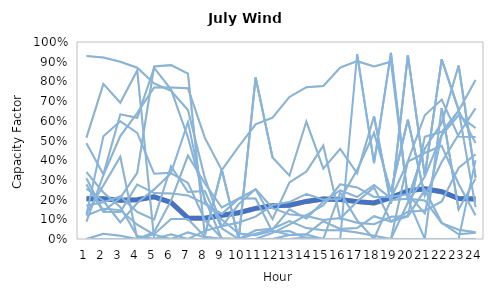
| Category | Series 0 | Series 52 | Series 53 | Series 54 | Series 55 | Series 56 | Series 57 | Series 58 | Series 59 | Series 60 | Series 61 | Series 62 | Series 63 | Series 64 | Series 65 | Series 66 | Series 67 | Series 68 | Series 69 | Series 70 | Series 71 | Series 72 | Series 73 | Series 74 | Series 75 | Series 76 | Series 77 | Series 78 | Series 79 | Series 80 | Series 81 | Series 82 | Series 83 | Series 84 | Series 85 | Series 86 | Series 87 | Series 88 | Series 89 | Series 90 | Series 91 | Series 92 | Series 93 | Series 94 | Series 95 | Series 96 | Series 97 | Series 98 | Series 99 | Series 100 | Series 101 | Series 1 | Series 2 | Series 3 | Series 4 | Series 5 | Series 6 | Series 7 | Series 8 | Series 9 | Series 10 | Series 11 | Series 12 | Series 13 | Series 14 | Series 15 | Series 16 | Series 17 | Series 18 | Series 19 | Series 20 | Series 21 | Series 22 | Series 23 | Series 24 | Series 25 | Series 26 | Series 27 | Series 28 | Series 29 | Series 30 | Series 31 | Series 32 | Series 33 | Series 34 | Series 35 | Series 36 | Series 37 | Series 38 | Series 39 | Series 40 | Series 41 | Series 42 | Series 43 | Series 44 | Series 45 | Series 46 | Series 47 | Series 48 | Series 49 | Series 50 | Series 51 |
|---|---|---|---|---|---|---|---|---|---|---|---|---|---|---|---|---|---|---|---|---|---|---|---|---|---|---|---|---|---|---|---|---|---|---|---|---|---|---|---|---|---|---|---|---|---|---|---|---|---|---|---|---|---|---|---|---|---|---|---|---|---|---|---|---|---|---|---|---|---|---|---|---|---|---|---|---|---|---|---|---|---|---|---|---|---|---|---|---|---|---|---|---|---|---|---|---|---|---|---|---|---|---|
| 0 | 0.204 | 0.308 |  |  |  | 0.929 |  |  |  | 0 |  |  |  | 0.123 |  |  |  | 0.339 |  | 0.119 |  | 0.255 |  | 0 |  | 0.129 |  |  |  | 0.514 |  |  |  | 0.276 |  |  |  | 0.088 |  |  |  | 0.486 |  |  |  | 0 |  |  |  |  | 0.171 | 0.204 | 0.308 |  |  |  | 0.929 |  |  |  | 0 |  |  |  | 0.123 |  |  |  | 0.339 |  | 0.119 |  | 0.255 |  | 0 |  | 0.129 |  |  |  | 0.514 |  |  |  | 0.276 |  |  |  | 0.088 |  |  |  | 0.486 |  |  |  | 0 |  |  |  |  | 0.171 |
| 1 | 0.204 | 0.14 |  |  |  | 0.921 |  |  |  | 0 |  |  |  | 0.521 |  |  |  | 0.236 |  | 0.154 |  | 0.194 |  | 0.026 |  | 0.272 |  |  |  | 0.787 |  |  |  | 0.138 |  |  |  | 0.325 |  |  |  | 0.328 |  |  |  | 0 |  |  |  |  | 0.186 | 0.204 | 0.14 |  |  |  | 0.921 |  |  |  | 0 |  |  |  | 0.521 |  |  |  | 0.236 |  | 0.154 |  | 0.194 |  | 0.026 |  | 0.272 |  |  |  | 0.787 |  |  |  | 0.138 |  |  |  | 0.325 |  |  |  | 0.328 |  |  |  | 0 |  |  |  |  | 0.186 |
| 2 | 0.197 | 0.209 |  |  |  | 0.899 |  |  |  | 0 |  |  |  | 0.597 |  |  |  | 0.162 |  | 0.147 |  | 0.084 |  | 0.017 |  | 0.417 |  |  |  | 0.692 |  |  |  | 0.138 |  |  |  | 0.522 |  |  |  | 0.633 |  |  |  | 0 |  |  |  |  | 0.216 | 0.197 | 0.209 |  |  |  | 0.899 |  |  |  | 0 |  |  |  | 0.597 |  |  |  | 0.162 |  | 0.147 |  | 0.084 |  | 0.017 |  | 0.417 |  |  |  | 0.692 |  |  |  | 0.138 |  |  |  | 0.522 |  |  |  | 0.633 |  |  |  | 0 |  |  |  |  | 0.216 |
| 3 | 0.199 | 0.336 |  |  |  | 0.869 |  |  |  | 0 |  |  |  | 0.538 |  |  |  | 0.015 |  | 0.072 |  | 0.182 |  | 0 |  | 0 |  |  |  | 0.855 |  |  |  | 0.277 |  |  |  | 0.64 |  |  |  | 0.615 |  |  |  | 0 |  |  |  |  | 0.137 | 0.199 | 0.336 |  |  |  | 0.869 |  |  |  | 0 |  |  |  | 0.538 |  |  |  | 0.015 |  | 0.072 |  | 0.182 |  | 0 |  | 0 |  |  |  | 0.855 |  |  |  | 0.277 |  |  |  | 0.64 |  |  |  | 0.615 |  |  |  | 0 |  |  |  |  | 0.137 |
| 4 | 0.214 | 0.876 |  |  |  | 0.789 |  |  |  | 0.024 |  |  |  | 0.331 |  |  |  | 0 |  | 0.022 |  | 0.252 |  | 0 |  | 0.034 |  |  |  | 0 |  |  |  | 0.233 |  |  |  | 0.769 |  |  |  | 0.869 |  |  |  | 0 |  |  |  |  | 0.098 | 0.214 | 0.876 |  |  |  | 0.789 |  |  |  | 0.024 |  |  |  | 0.331 |  |  |  | 0 |  | 0.022 |  | 0.252 |  | 0 |  | 0.034 |  |  |  | 0 |  |  |  | 0.233 |  |  |  | 0.769 |  |  |  | 0.869 |  |  |  | 0 |  |  |  |  | 0.098 |
| 5 | 0.186 | 0.883 |  |  |  | 0.753 |  |  |  | 0.101 |  |  |  | 0.336 |  |  |  | 0.024 |  | 0 |  | 0.334 |  | 0 |  | 0.194 |  |  |  | 0 |  |  |  | 0.232 |  |  |  | 0.769 |  |  |  | 0.759 |  |  |  | 0 |  |  |  |  | 0.37 | 0.186 | 0.883 |  |  |  | 0.753 |  |  |  | 0.101 |  |  |  | 0.336 |  |  |  | 0.024 |  | 0 |  | 0.334 |  | 0 |  | 0.194 |  |  |  | 0 |  |  |  | 0.232 |  |  |  | 0.769 |  |  |  | 0.759 |  |  |  | 0 |  |  |  |  | 0.37 |
| 6 | 0.106 | 0.84 |  |  |  | 0.654 |  |  |  | 0.101 |  |  |  | 0.593 |  |  |  | 0 |  | 0 |  | 0.285 |  | 0.033 |  | 0.424 |  |  |  | 0 |  |  |  | 0.221 |  |  |  | 0.765 |  |  |  | 0.515 |  |  |  | 0 |  |  |  |  | 0.239 | 0.106 | 0.84 |  |  |  | 0.654 |  |  |  | 0.101 |  |  |  | 0.593 |  |  |  | 0 |  | 0 |  | 0.285 |  | 0.033 |  | 0.424 |  |  |  | 0 |  |  |  | 0.221 |  |  |  | 0.765 |  |  |  | 0.515 |  |  |  | 0 |  |  |  |  | 0.239 |
| 7 | 0.105 | 0.019 |  |  |  | 0.31 |  |  |  | 0.012 |  |  |  | 0.188 |  |  |  | 0 |  | 0 |  | 0.096 |  | 0.008 |  | 0.282 |  |  |  | 0.041 |  |  |  | 0.178 |  |  |  | 0.513 |  |  |  | 0.202 |  |  |  | 0 |  |  |  |  | 0.244 | 0.105 | 0.019 |  |  |  | 0.31 |  |  |  | 0.012 |  |  |  | 0.188 |  |  |  | 0 |  | 0 |  | 0.096 |  | 0.008 |  | 0.282 |  |  |  | 0.041 |  |  |  | 0.178 |  |  |  | 0.513 |  |  |  | 0.202 |  |  |  | 0 |  |  |  |  | 0.244 |
| 8 | 0.121 | 0.351 |  |  |  | 0.063 |  |  |  | 0 |  |  |  | 0.099 |  |  |  | 0 |  | 0 |  | 0.004 |  | 0 |  | 0.16 |  |  |  | 0.065 |  |  |  | 0.127 |  |  |  | 0.35 |  |  |  | 0 |  |  |  | 0 |  |  |  |  | 0.054 | 0.121 | 0.351 |  |  |  | 0.063 |  |  |  | 0 |  |  |  | 0.099 |  |  |  | 0 |  | 0 |  | 0.004 |  | 0 |  | 0.16 |  |  |  | 0.065 |  |  |  | 0.127 |  |  |  | 0.35 |  |  |  | 0 |  |  |  | 0 |  |  |  |  | 0.054 |
| 9 | 0.133 | 0 |  |  |  | 0.177 |  |  |  | 0 |  |  |  | 0.028 |  |  |  | 0 |  | 0 |  | 0 |  | 0 |  | 0.206 |  |  |  | 0.084 |  |  |  | 0.205 |  |  |  | 0.47 |  |  |  | 0 |  |  |  | 0 |  |  |  |  | 0 | 0.133 | 0 |  |  |  | 0.177 |  |  |  | 0 |  |  |  | 0.028 |  |  |  | 0 |  | 0 |  | 0 |  | 0 |  | 0.206 |  |  |  | 0.084 |  |  |  | 0.205 |  |  |  | 0.47 |  |  |  | 0 |  |  |  | 0 |  |  |  |  | 0 |
| 10 | 0.155 | 0.82 |  |  |  | 0.253 |  |  |  | 0 |  |  |  | 0.019 |  |  |  | 0 |  | 0 |  | 0.044 |  | 0 |  | 0.205 |  |  |  | 0.113 |  |  |  | 0.252 |  |  |  | 0.582 |  |  |  | 0.027 |  |  |  | 0 |  |  |  |  | 0 | 0.155 | 0.82 |  |  |  | 0.253 |  |  |  | 0 |  |  |  | 0.019 |  |  |  | 0 |  | 0 |  | 0.044 |  | 0 |  | 0.205 |  |  |  | 0.113 |  |  |  | 0.252 |  |  |  | 0.582 |  |  |  | 0.027 |  |  |  | 0 |  |  |  |  | 0 |
| 11 | 0.169 | 0.414 |  |  |  | 0.156 |  |  |  | 0 |  |  |  | 0.042 |  |  |  | 0.031 |  | 0 |  | 0.052 |  | 0 |  | 0.036 |  |  |  | 0.172 |  |  |  | 0.101 |  |  |  | 0.616 |  |  |  | 0.049 |  |  |  | 0 |  |  |  |  | 0 | 0.169 | 0.414 |  |  |  | 0.156 |  |  |  | 0 |  |  |  | 0.042 |  |  |  | 0.031 |  | 0 |  | 0.052 |  | 0 |  | 0.036 |  |  |  | 0.172 |  |  |  | 0.101 |  |  |  | 0.616 |  |  |  | 0.049 |  |  |  | 0 |  |  |  |  | 0 |
| 12 | 0.172 | 0.321 |  |  |  | 0.125 |  |  |  | 0 |  |  |  | 0.02 |  |  |  | 0.073 |  | 0 |  | 0.09 |  | 0 |  | 0.04 |  |  |  | 0.187 |  |  |  | 0.288 |  |  |  | 0.721 |  |  |  | 0.151 |  |  |  | 0.021 |  |  |  |  | 0 | 0.172 | 0.321 |  |  |  | 0.125 |  |  |  | 0 |  |  |  | 0.02 |  |  |  | 0.073 |  | 0 |  | 0.09 |  | 0 |  | 0.04 |  |  |  | 0.187 |  |  |  | 0.288 |  |  |  | 0.721 |  |  |  | 0.151 |  |  |  | 0.021 |  |  |  |  | 0 |
| 13 | 0.191 | 0.596 |  |  |  | 0.117 |  |  |  | 0.007 |  |  |  | 0.023 |  |  |  | 0.122 |  | 0 |  | 0.055 |  | 0 |  | 0.002 |  |  |  | 0.229 |  |  |  | 0.342 |  |  |  | 0.771 |  |  |  | 0.104 |  |  |  | 0.024 |  |  |  |  | 0 | 0.191 | 0.596 |  |  |  | 0.117 |  |  |  | 0.007 |  |  |  | 0.023 |  |  |  | 0.122 |  | 0 |  | 0.055 |  | 0 |  | 0.002 |  |  |  | 0.229 |  |  |  | 0.342 |  |  |  | 0.771 |  |  |  | 0.104 |  |  |  | 0.024 |  |  |  |  | 0 |
| 14 | 0.203 | 0.357 |  |  |  | 0.096 |  |  |  | 0 |  |  |  | 0 |  |  |  | 0.171 |  | 0 |  | 0.045 |  | 0 |  | 0 |  |  |  | 0.2 |  |  |  | 0.474 |  |  |  | 0.777 |  |  |  | 0.19 |  |  |  | 0.09 |  |  |  |  | 0 | 0.203 | 0.357 |  |  |  | 0.096 |  |  |  | 0 |  |  |  | 0 |  |  |  | 0.171 |  | 0 |  | 0.045 |  | 0 |  | 0 |  |  |  | 0.2 |  |  |  | 0.474 |  |  |  | 0.777 |  |  |  | 0.19 |  |  |  | 0.09 |  |  |  |  | 0 |
| 15 | 0.2 | 0.458 |  |  |  | 0.106 |  |  |  | 0 |  |  |  | 0 |  |  |  | 0.278 |  | 0 |  | 0.044 |  | 0 |  | 0.236 |  |  |  | 0.203 |  |  |  | 0.104 |  |  |  | 0.87 |  |  |  | 0.247 |  |  |  | 0.051 |  |  |  |  | 0 | 0.2 | 0.458 |  |  |  | 0.106 |  |  |  | 0 |  |  |  | 0 |  |  |  | 0.278 |  | 0 |  | 0.044 |  | 0 |  | 0.236 |  |  |  | 0.203 |  |  |  | 0.104 |  |  |  | 0.87 |  |  |  | 0.247 |  |  |  | 0.051 |  |  |  |  | 0 |
| 16 | 0.19 | 0.334 |  |  |  | 0.082 |  |  |  | 0 |  |  |  | 0.939 |  |  |  | 0.262 |  | 0 |  | 0.033 |  | 0 |  | 0.095 |  |  |  | 0.35 |  |  |  | 0.19 |  |  |  | 0.903 |  |  |  | 0.213 |  |  |  | 0.055 |  |  |  |  | 0 | 0.19 | 0.334 |  |  |  | 0.082 |  |  |  | 0 |  |  |  | 0.939 |  |  |  | 0.262 |  | 0 |  | 0.033 |  | 0 |  | 0.095 |  |  |  | 0.35 |  |  |  | 0.19 |  |  |  | 0.903 |  |  |  | 0.213 |  |  |  | 0.055 |  |  |  |  | 0 |
| 17 | 0.183 | 0.623 |  |  |  | 0.075 |  |  |  | 0 |  |  |  | 0.385 |  |  |  | 0.214 |  | 0 |  | 0.017 |  | 0 |  | 0 |  |  |  | 0.538 |  |  |  | 0.262 |  |  |  | 0.876 |  |  |  | 0.275 |  |  |  | 0.116 |  |  |  |  | 0 | 0.183 | 0.623 |  |  |  | 0.075 |  |  |  | 0 |  |  |  | 0.385 |  |  |  | 0.214 |  | 0 |  | 0.017 |  | 0 |  | 0 |  |  |  | 0.538 |  |  |  | 0.262 |  |  |  | 0.876 |  |  |  | 0.275 |  |  |  | 0.116 |  |  |  |  | 0 |
| 18 | 0.21 | 0.178 |  |  |  | 0.113 |  |  |  | 0 |  |  |  | 0.945 |  |  |  | 0.214 |  | 0 |  | 0 |  | 0 |  | 0.198 |  |  |  | 0.241 |  |  |  | 0.089 |  |  |  | 0.9 |  |  |  | 0.206 |  |  |  | 0.088 |  |  |  |  | 0 | 0.21 | 0.178 |  |  |  | 0.113 |  |  |  | 0 |  |  |  | 0.945 |  |  |  | 0.214 |  | 0 |  | 0 |  | 0 |  | 0.198 |  |  |  | 0.241 |  |  |  | 0.089 |  |  |  | 0.9 |  |  |  | 0.206 |  |  |  | 0.088 |  |  |  |  | 0 |
| 19 | 0.245 | 0.933 |  |  |  | 0.115 |  |  |  | 0.395 |  |  |  | 0.2 |  |  |  | 0.228 |  | 0 |  | 0.185 |  | 0 |  | 0.204 |  |  |  | 0.605 |  |  |  | 0.138 |  |  |  | 0.203 |  |  |  | 0.393 |  |  |  | 0.115 |  |  |  |  | 0 | 0.245 | 0.933 |  |  |  | 0.115 |  |  |  | 0.395 |  |  |  | 0.2 |  |  |  | 0.228 |  | 0 |  | 0.185 |  | 0 |  | 0.204 |  |  |  | 0.605 |  |  |  | 0.138 |  |  |  | 0.203 |  |  |  | 0.393 |  |  |  | 0.115 |  |  |  |  | 0 |
| 20 | 0.254 | 0.322 |  |  |  | 0.519 |  |  |  | 0.628 |  |  |  | 0 |  |  |  | 0.13 |  | 0 |  | 0.317 |  | 0 |  | 0.196 |  |  |  | 0.22 |  |  |  | 0.145 |  |  |  | 0.459 |  |  |  | 0.437 |  |  |  | 0.249 |  |  |  |  | 0 | 0.254 | 0.322 |  |  |  | 0.519 |  |  |  | 0.628 |  |  |  | 0 |  |  |  | 0.13 |  | 0 |  | 0.317 |  | 0 |  | 0.196 |  |  |  | 0.22 |  |  |  | 0.145 |  |  |  | 0.459 |  |  |  | 0.437 |  |  |  | 0.249 |  |  |  |  | 0 |
| 21 | 0.24 | 0.912 |  |  |  | 0.544 |  |  |  | 0.708 |  |  |  | 0 |  |  |  | 0.527 |  | 0 |  | 0.528 |  | 0.665 |  | 0.08 |  |  |  | 0.391 |  |  |  | 0.19 |  |  |  | 0.589 |  |  |  | 0.473 |  |  |  | 0.082 |  |  |  |  | 0 | 0.24 | 0.912 |  |  |  | 0.544 |  |  |  | 0.708 |  |  |  | 0 |  |  |  | 0.527 |  | 0 |  | 0.528 |  | 0.665 |  | 0.08 |  |  |  | 0.391 |  |  |  | 0.19 |  |  |  | 0.589 |  |  |  | 0.473 |  |  |  | 0.082 |  |  |  |  | 0 |
| 22 | 0.206 | 0.655 |  |  |  | 0.651 |  |  |  | 0.52 |  |  |  | 0 |  |  |  | 0.627 |  | 0 |  | 0.651 |  | 0.15 |  | 0.047 |  |  |  | 0.531 |  |  |  | 0.361 |  |  |  | 0.88 |  |  |  | 0.279 |  |  |  | 0.024 |  |  |  |  | 0 | 0.206 | 0.655 |  |  |  | 0.651 |  |  |  | 0.52 |  |  |  | 0 |  |  |  | 0.627 |  | 0 |  | 0.651 |  | 0.15 |  | 0.047 |  |  |  | 0.531 |  |  |  | 0.361 |  |  |  | 0.88 |  |  |  | 0.279 |  |  |  | 0.024 |  |  |  |  | 0 |
| 23 | 0.203 | 0.162 |  |  |  | 0.487 |  |  |  | 0.518 |  |  |  | 0.4 |  |  |  | 0.563 |  | 0 |  | 0.807 |  | 0.306 |  | 0.035 |  |  |  | 0.663 |  |  |  | 0.43 |  |  |  | 0.312 |  |  |  | 0.121 |  |  |  | 0.032 |  |  |  |  | 0 | 0.203 | 0.162 |  |  |  | 0.487 |  |  |  | 0.518 |  |  |  | 0.4 |  |  |  | 0.563 |  | 0 |  | 0.807 |  | 0.306 |  | 0.035 |  |  |  | 0.663 |  |  |  | 0.43 |  |  |  | 0.312 |  |  |  | 0.121 |  |  |  | 0.032 |  |  |  |  | 0 |